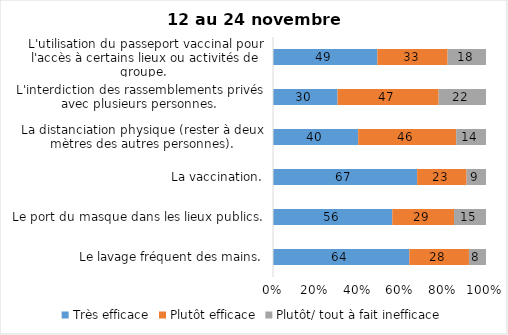
| Category | Très efficace | Plutôt efficace | Plutôt/ tout à fait inefficace |
|---|---|---|---|
| Le lavage fréquent des mains. | 64 | 28 | 8 |
| Le port du masque dans les lieux publics. | 56 | 29 | 15 |
| La vaccination. | 67 | 23 | 9 |
| La distanciation physique (rester à deux mètres des autres personnes). | 40 | 46 | 14 |
| L'interdiction des rassemblements privés avec plusieurs personnes. | 30 | 47 | 22 |
| L'utilisation du passeport vaccinal pour l'accès à certains lieux ou activités de groupe.  | 49 | 33 | 18 |